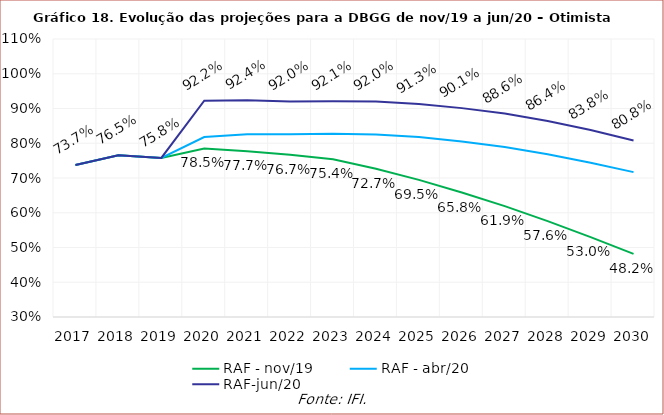
| Category | RAF - nov/19 | RAF - abr/20 | RAF-jun/20 |
|---|---|---|---|
| 2017.0 | 0.737 | 0.737 | 0.737 |
| 2018.0 | 0.765 | 0.765 | 0.765 |
| 2019.0 | 0.758 | 0.758 | 0.758 |
| 2020.0 | 0.785 | 0.818 | 0.922 |
| 2021.0 | 0.777 | 0.826 | 0.924 |
| 2022.0 | 0.767 | 0.826 | 0.92 |
| 2023.0 | 0.754 | 0.827 | 0.921 |
| 2024.0 | 0.727 | 0.825 | 0.92 |
| 2025.0 | 0.695 | 0.818 | 0.913 |
| 2026.0 | 0.658 | 0.805 | 0.901 |
| 2027.0 | 0.619 | 0.789 | 0.886 |
| 2028.0 | 0.576 | 0.768 | 0.864 |
| 2029.0 | 0.53 | 0.744 | 0.838 |
| 2030.0 | 0.482 | 0.717 | 0.808 |